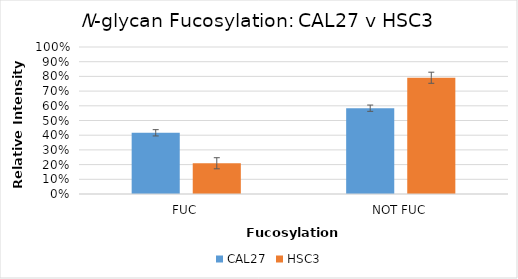
| Category | CAL27 | HSC3 |
|---|---|---|
| FUC | 0.416 | 0.209 |
| NOT FUC | 0.584 | 0.791 |